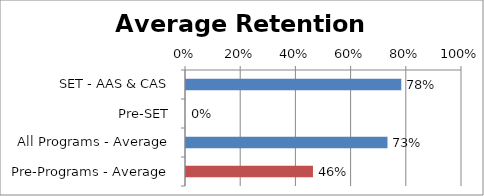
| Category | Series 0 |
|---|---|
| SET - AAS & CAS | 0.78 |
| Pre-SET | 0 |
| All Programs - Average | 0.73 |
| Pre-Programs - Average | 0.46 |